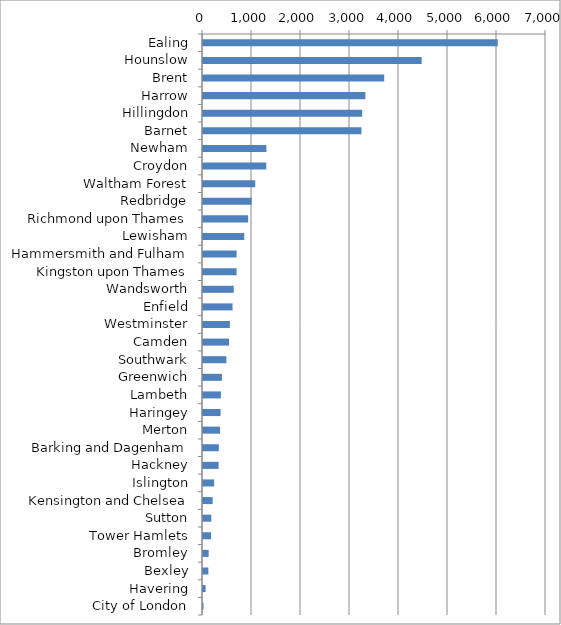
| Category | Series 0 |
|---|---|
| Ealing | 6015 |
| Hounslow | 4463 |
| Brent | 3698 |
| Harrow | 3314 |
| Hillingdon | 3248 |
| Barnet | 3234 |
| Newham | 1294 |
| Croydon | 1291 |
| Waltham Forest | 1066 |
| Redbridge | 992 |
| Richmond upon Thames | 921 |
| Lewisham | 842 |
| Hammersmith and Fulham | 686 |
| Kingston upon Thames | 685 |
| Wandsworth | 627 |
| Enfield | 603 |
| Westminster | 549 |
| Camden | 531 |
| Southwark | 477 |
| Greenwich | 386 |
| Lambeth | 365 |
| Haringey | 359 |
| Merton | 348 |
| Barking and Dagenham | 322 |
| Hackney | 318 |
| Islington | 227 |
| Kensington and Chelsea | 197 |
| Sutton | 170 |
| Tower Hamlets | 165 |
| Bromley | 115 |
| Bexley | 109 |
| Havering | 53 |
| City of London | 10 |